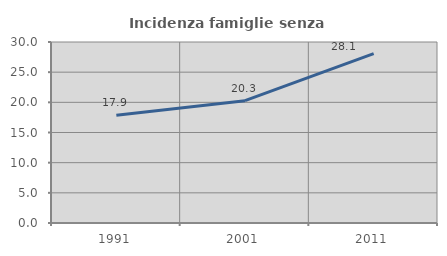
| Category | Incidenza famiglie senza nuclei |
|---|---|
| 1991.0 | 17.861 |
| 2001.0 | 20.271 |
| 2011.0 | 28.082 |